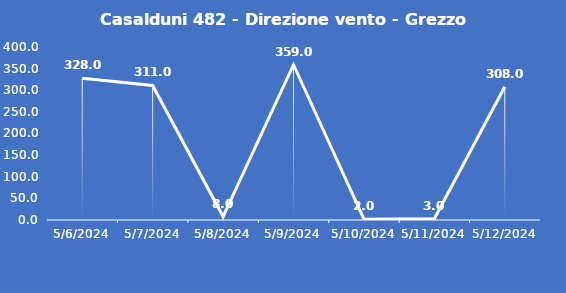
| Category | Casalduni 482 - Direzione vento - Grezzo (°N) |
|---|---|
| 5/6/24 | 328 |
| 5/7/24 | 311 |
| 5/8/24 | 8 |
| 5/9/24 | 359 |
| 5/10/24 | 2 |
| 5/11/24 | 3 |
| 5/12/24 | 308 |